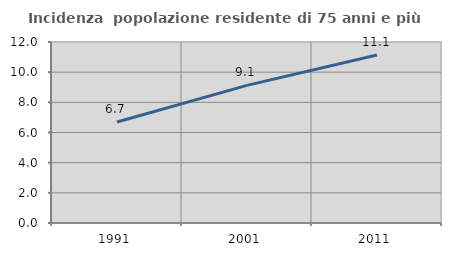
| Category | Incidenza  popolazione residente di 75 anni e più |
|---|---|
| 1991.0 | 6.694 |
| 2001.0 | 9.123 |
| 2011.0 | 11.143 |